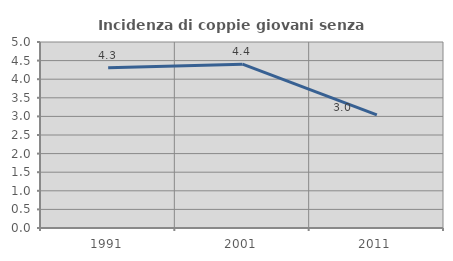
| Category | Incidenza di coppie giovani senza figli |
|---|---|
| 1991.0 | 4.305 |
| 2001.0 | 4.404 |
| 2011.0 | 3.04 |